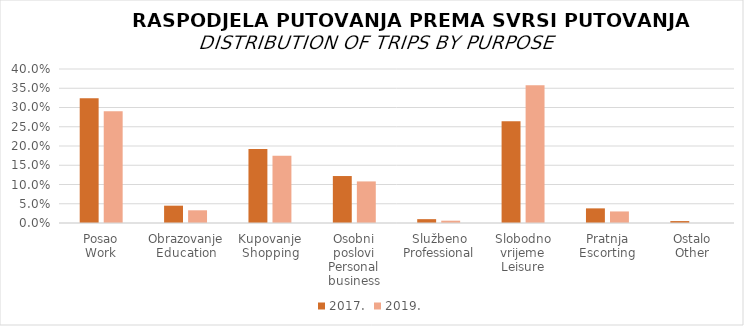
| Category | 2017. | 2019. |
|---|---|---|
| Posao
Work | 0.324 | 0.29 |
| Obrazovanje
Education | 0.045 | 0.033 |
| Kupovanje
Shopping | 0.192 | 0.175 |
| Osobni poslovi
Personal business | 0.122 | 0.108 |
| Službeno
Professional | 0.01 | 0.006 |
| Slobodno vrijeme
Leisure | 0.264 | 0.358 |
| Pratnja
Escorting | 0.038 | 0.03 |
| Ostalo
Other | 0.005 | 0 |